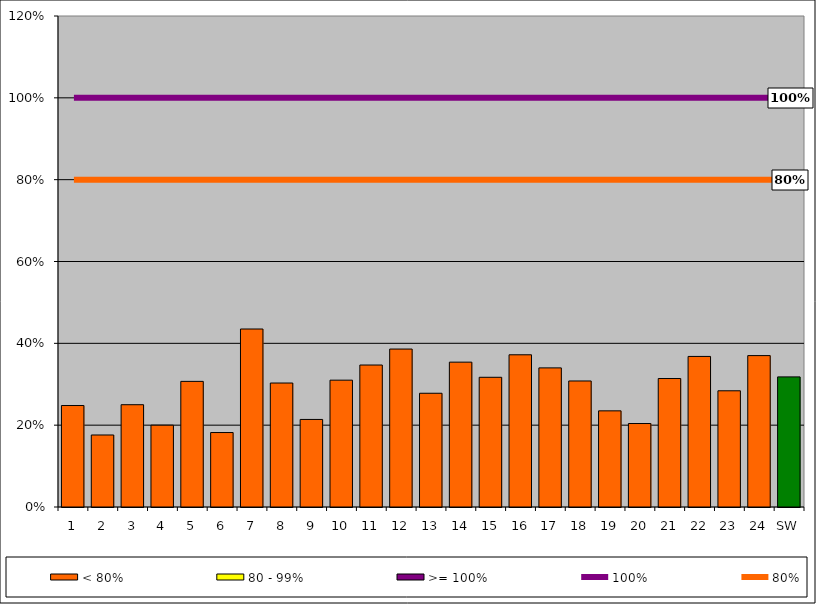
| Category | < 80% | 80 - 99% | >= 100% |
|---|---|---|---|
| 1 | 0.248 | 0 | 0 |
| 2 | 0.176 | 0 | 0 |
| 3 | 0.25 | 0 | 0 |
| 4 | 0.2 | 0 | 0 |
| 5 | 0.307 | 0 | 0 |
| 6 | 0.182 | 0 | 0 |
| 7 | 0.435 | 0 | 0 |
| 8 | 0.303 | 0 | 0 |
| 9 | 0.214 | 0 | 0 |
| 10 | 0.31 | 0 | 0 |
| 11 | 0.347 | 0 | 0 |
| 12 | 0.386 | 0 | 0 |
| 13 | 0.278 | 0 | 0 |
| 14 | 0.354 | 0 | 0 |
| 15 | 0.317 | 0 | 0 |
| 16 | 0.372 | 0 | 0 |
| 17 | 0.34 | 0 | 0 |
| 18 | 0.308 | 0 | 0 |
| 19 | 0.235 | 0 | 0 |
| 20 | 0.204 | 0 | 0 |
| 21 | 0.314 | 0 | 0 |
| 22 | 0.368 | 0 | 0 |
| 23 | 0.284 | 0 | 0 |
| 24 | 0.37 | 0 | 0 |
| SW | 0.318 | 0 | 0 |